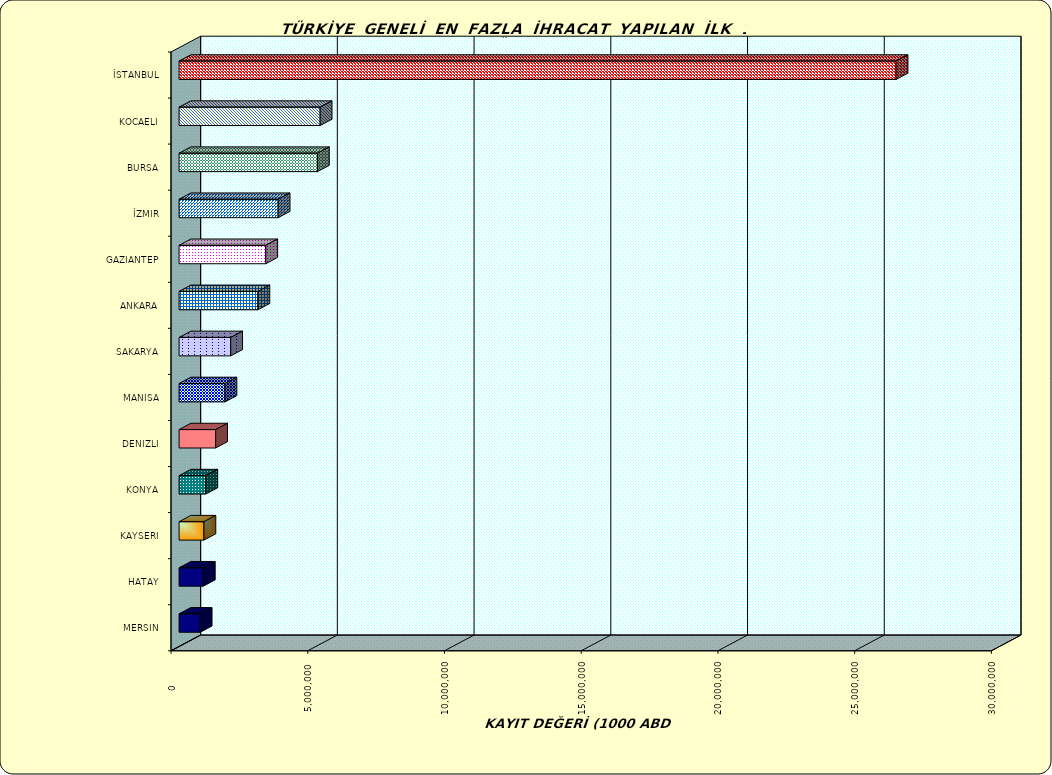
| Category | Series 0 |
|---|---|
| İSTANBUL | 26218673.133 |
| KOCAELI | 5159172.533 |
| BURSA | 5060078.017 |
| İZMIR | 3622986.943 |
| GAZIANTEP | 3170161.433 |
| ANKARA | 2883336.812 |
| SAKARYA | 1888163.562 |
| MANISA | 1678196.264 |
| DENIZLI | 1337215.112 |
| KONYA | 978081.454 |
| KAYSERI | 909526.31 |
| HATAY | 886152.751 |
| MERSIN | 772298.364 |